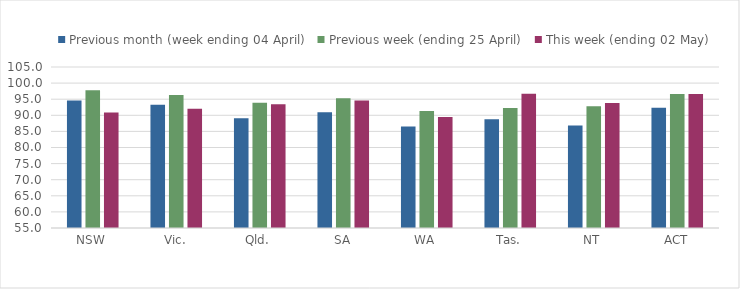
| Category | Previous month (week ending 04 April) | Previous week (ending 25 April) | This week (ending 02 May) |
|---|---|---|---|
| NSW | 94.57 | 97.766 | 90.885 |
| Vic. | 93.279 | 96.318 | 92.049 |
| Qld. | 89.077 | 93.92 | 93.457 |
| SA | 90.963 | 95.319 | 94.587 |
| WA | 86.487 | 91.315 | 89.497 |
| Tas. | 88.736 | 92.241 | 96.724 |
| NT | 86.814 | 92.797 | 93.788 |
| ACT | 92.309 | 96.609 | 96.6 |